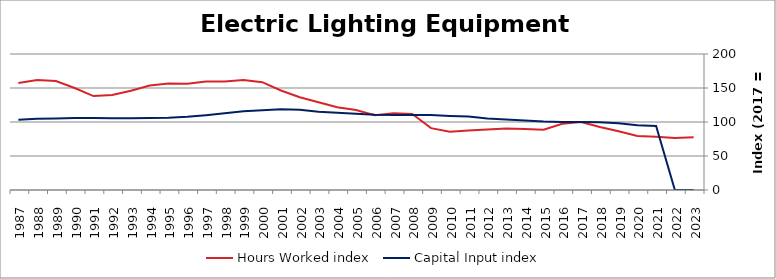
| Category | Hours Worked index | Capital Input index |
|---|---|---|
| 2023.0 | 77.587 | 0 |
| 2022.0 | 76.494 | 0 |
| 2021.0 | 78.474 | 94.034 |
| 2020.0 | 79.45 | 95.129 |
| 2019.0 | 86.429 | 98.186 |
| 2018.0 | 92.65 | 99.57 |
| 2017.0 | 100 | 100 |
| 2016.0 | 97.39 | 100.115 |
| 2015.0 | 88.544 | 100.56 |
| 2014.0 | 89.661 | 102.137 |
| 2013.0 | 90.458 | 103.708 |
| 2012.0 | 89.023 | 105.319 |
| 2011.0 | 87.425 | 107.938 |
| 2010.0 | 85.762 | 108.836 |
| 2009.0 | 91.015 | 110.232 |
| 2008.0 | 111.909 | 110.313 |
| 2007.0 | 112.883 | 110.45 |
| 2006.0 | 109.98 | 110.787 |
| 2005.0 | 117.649 | 111.959 |
| 2004.0 | 121.768 | 113.48 |
| 2003.0 | 129.048 | 115.172 |
| 2002.0 | 136.452 | 118.067 |
| 2001.0 | 146.391 | 118.739 |
| 2000.0 | 158.604 | 117.268 |
| 1999.0 | 161.6 | 115.797 |
| 1998.0 | 159.434 | 112.867 |
| 1997.0 | 159.512 | 110.043 |
| 1996.0 | 156.229 | 107.687 |
| 1995.0 | 156.776 | 106.366 |
| 1994.0 | 153.691 | 105.878 |
| 1993.0 | 146.088 | 105.695 |
| 1992.0 | 139.83 | 105.406 |
| 1991.0 | 138.077 | 105.968 |
| 1990.0 | 150.042 | 106.036 |
| 1989.0 | 160.291 | 105.066 |
| 1988.0 | 161.766 | 104.652 |
| 1987.0 | 157.195 | 103.175 |